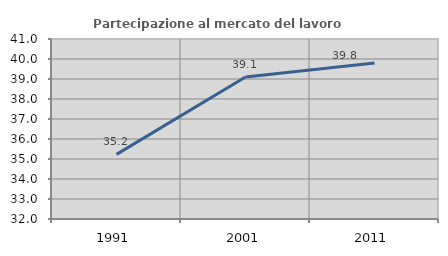
| Category | Partecipazione al mercato del lavoro  femminile |
|---|---|
| 1991.0 | 35.233 |
| 2001.0 | 39.102 |
| 2011.0 | 39.803 |